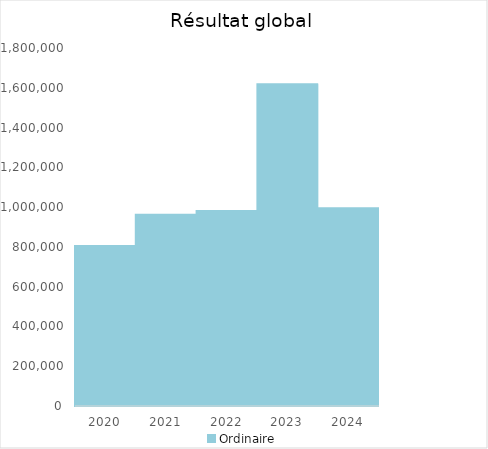
| Category |   | Ordinaire |    |
|---|---|---|---|
| 2020.0 |  | 804240.72 |  |
| 2021.0 |  | 962034.78 |  |
| 2022.0 |  | 979849.12 |  |
| 2023.0 |  | 1617461.99 |  |
| 2024.0 |  | 993726.62 |  |